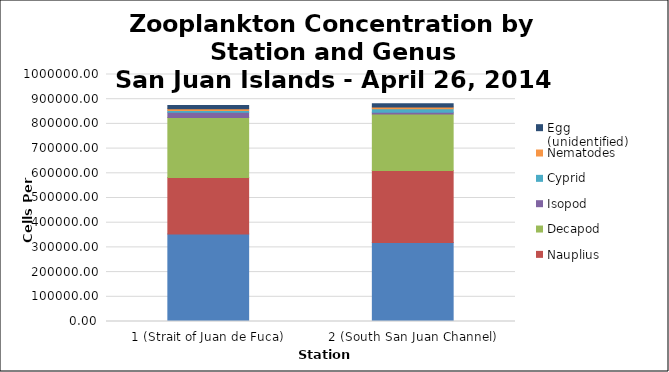
| Category | Copepod | Nauplius | Decapod | Isopod | Cyprid | Nematodes | Egg (unidentified) |
|---|---|---|---|---|---|---|---|
| 1 (Strait of Juan de Fuca) | 354166.667 | 229166.667 | 243055.556 | 20833.333 | 6944.444 | 6944.444 | 13888.889 |
| 2 (South San Juan Channel) | 319444.444 | 291666.667 | 229166.667 | 6944.444 | 13888.889 | 6944.444 | 13888.889 |